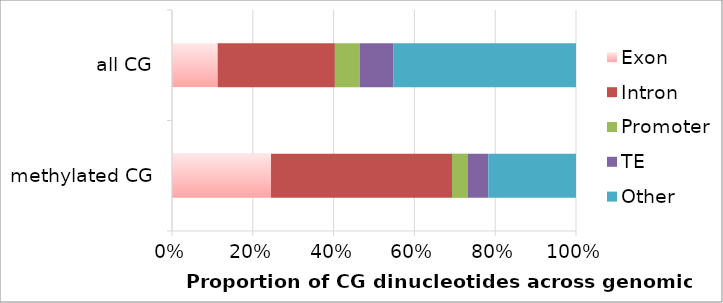
| Category | Exon | Intron | Promoter | TE | Other |
|---|---|---|---|---|---|
| methylated CG | 356323 | 651253 | 57498 | 73083 | 315596 |
| all CG | 1134622 | 2912003 | 616140 | 832569 | 4540367 |